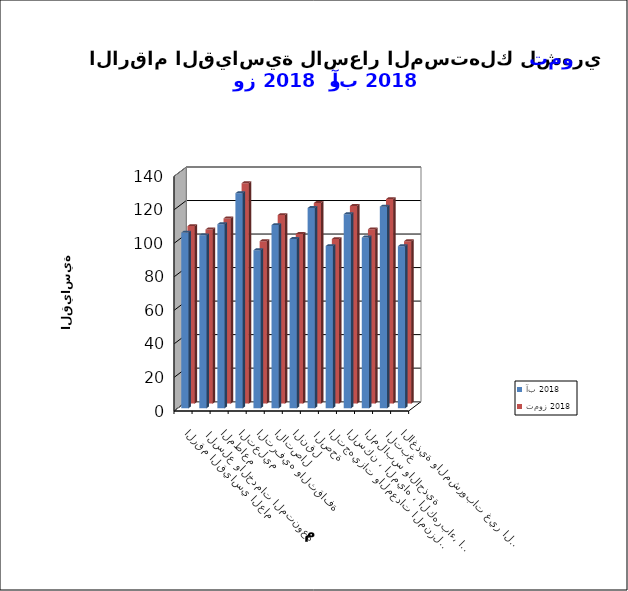
| Category | آب 2018      | تموز 2018       |
|---|---|---|
| الاغذية والمشروبات غير الكحولية | 96.7 | 96.9 |
|  التبغ | 120.3 | 122 |
| الملابس والاحذية | 101.9 | 104 |
| السكن ، المياه ، الكهرباء، الغاز  | 115.8 | 117.9 |
| التجهيزات والمعدات المنزلية والصيانة | 96.8 | 98.2 |
|  الصحة | 119.5 | 119.7 |
| النقل | 101 | 101.2 |
| الاتصال | 109.3 | 112.5 |
| الترفيه والثقافة | 94.3 | 96.9 |
| التعليم | 128.3 | 131.5 |
| المطاعم  | 109.8 | 110.5 |
|  السلع والخدمات المتنوعة | 103.2 | 103.9 |
| الرقم القياسي العام | 104.8 | 105.9 |